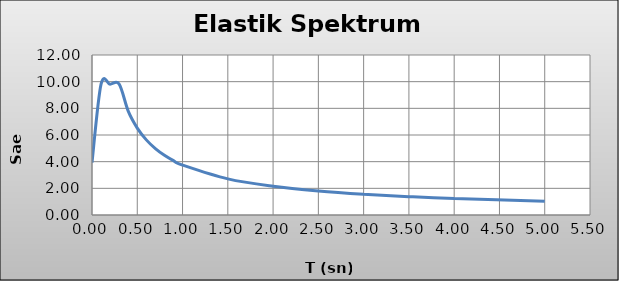
| Category | Series 0 |
|---|---|
| 0.0 | 3.924 |
| 0.1 | 9.81 |
| 0.2 | 9.81 |
| 0.3 | 9.81 |
| 0.4 | 7.793 |
| 0.5 | 6.519 |
| 0.6 | 5.634 |
| 0.7 | 4.981 |
| 0.8 | 4.476 |
| 0.9 | 4.074 |
| 1.0 | 3.744 |
| 1.5 | 2.707 |
| 2.0 | 2.151 |
| 2.5 | 1.799 |
| 3.0 | 1.555 |
| 3.5 | 1.374 |
| 4.0 | 1.235 |
| 5.0 | 1.033 |